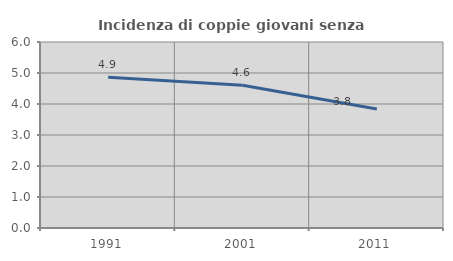
| Category | Incidenza di coppie giovani senza figli |
|---|---|
| 1991.0 | 4.864 |
| 2001.0 | 4.606 |
| 2011.0 | 3.842 |